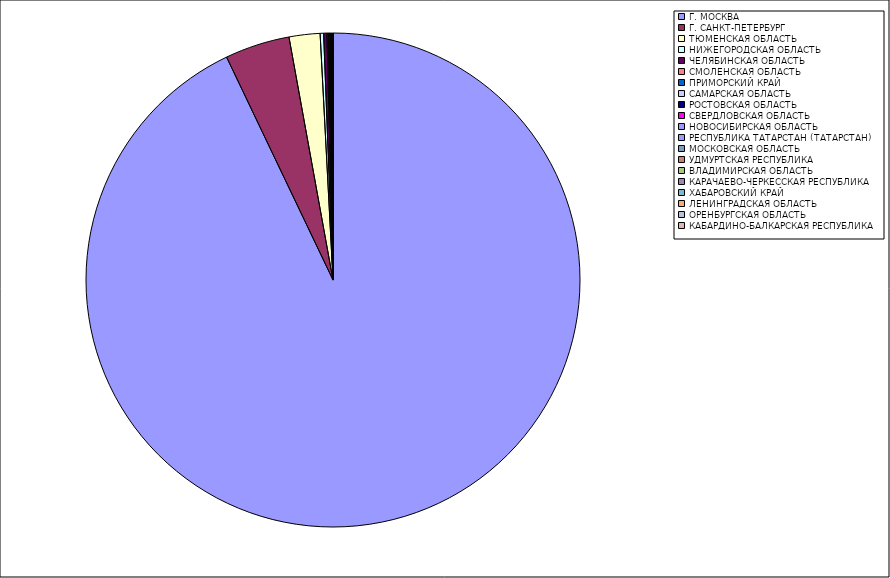
| Category | Оборот |
|---|---|
| Г. МОСКВА | 92.857 |
| Г. САНКТ-ПЕТЕРБУРГ | 4.234 |
| ТЮМЕНСКАЯ ОБЛАСТЬ | 2.02 |
| НИЖЕГОРОДСКАЯ ОБЛАСТЬ | 0.227 |
| ЧЕЛЯБИНСКАЯ ОБЛАСТЬ | 0.214 |
| СМОЛЕНСКАЯ ОБЛАСТЬ | 0.07 |
| ПРИМОРСКИЙ КРАЙ | 0.062 |
| САМАРСКАЯ ОБЛАСТЬ | 0.058 |
| РОСТОВСКАЯ ОБЛАСТЬ | 0.038 |
| СВЕРДЛОВСКАЯ ОБЛАСТЬ | 0.03 |
| НОВОСИБИРСКАЯ ОБЛАСТЬ | 0.029 |
| РЕСПУБЛИКА ТАТАРСТАН (ТАТАРСТАН) | 0.024 |
| МОСКОВСКАЯ ОБЛАСТЬ | 0.017 |
| УДМУРТСКАЯ РЕСПУБЛИКА | 0.013 |
| ВЛАДИМИРСКАЯ ОБЛАСТЬ | 0.011 |
| КАРАЧАЕВО-ЧЕРКЕССКАЯ РЕСПУБЛИКА | 0.01 |
| ХАБАРОВСКИЙ КРАЙ | 0.009 |
| ЛЕНИНГРАДСКАЯ ОБЛАСТЬ | 0.008 |
| ОРЕНБУРГСКАЯ ОБЛАСТЬ | 0.008 |
| КАБАРДИНО-БАЛКАРСКАЯ РЕСПУБЛИКА | 0.005 |